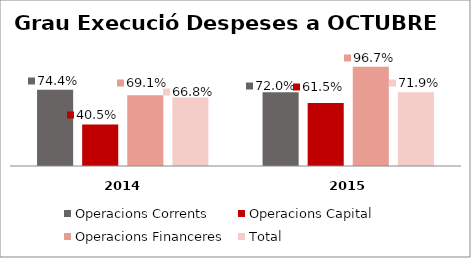
| Category | Operacions Corrents | Operacions Capital | Operacions Financeres | Total |
|---|---|---|---|---|
| 0 | 0.744 | 0.405 | 0.691 | 0.668 |
| 1 | 0.72 | 0.615 | 0.967 | 0.719 |